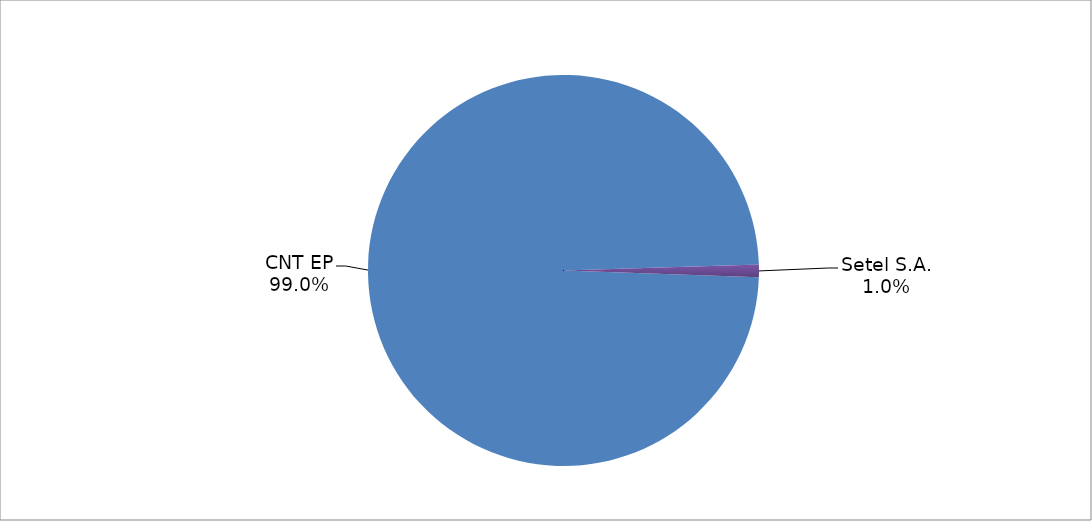
| Category | Series 0 |
|---|---|
| CNT EP | 285 |
| Setel S.A. | 3 |